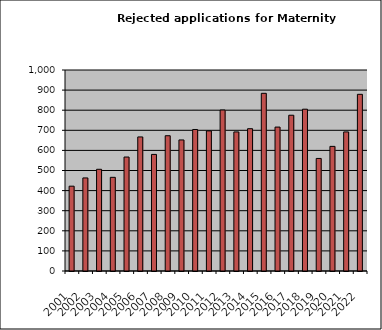
| Category | Series 0 |
|---|---|
| 2001.0 | 422 |
| 2002.0 | 463 |
| 2003.0 | 506 |
| 2004.0 | 466 |
| 2005.0 | 567 |
| 2006.0 | 667 |
| 2007.0 | 580 |
| 2008.0 | 673 |
| 2009.0 | 652 |
| 2010.0 | 704 |
| 2011.0 | 697 |
| 2012.0 | 801 |
| 2013.0 | 692 |
| 2014.0 | 708 |
| 2015.0 | 884 |
| 2016.0 | 716 |
| 2017.0 | 775 |
| 2018.0 | 805 |
| 2019.0 | 560 |
| 2020.0 | 620 |
| 2021.0 | 692 |
| 2022.0 | 879 |